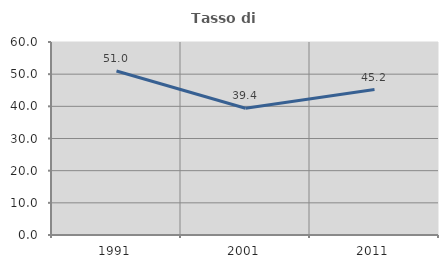
| Category | Tasso di occupazione   |
|---|---|
| 1991.0 | 51 |
| 2001.0 | 39.423 |
| 2011.0 | 45.205 |